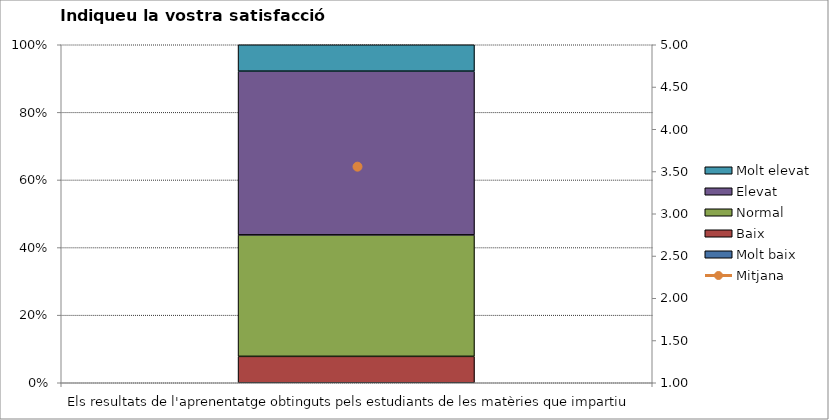
| Category | Molt baix | Baix | Normal  | Elevat | Molt elevat |
|---|---|---|---|---|---|
| Els resultats de l'aprenentatge obtinguts pels estudiants de les matèries que impartiu | 0 | 5 | 23 | 31 | 5 |